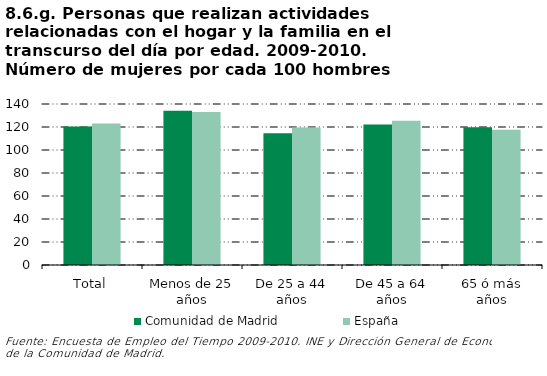
| Category | Comunidad de Madrid | España |
|---|---|---|
| Total | 120.494 | 123.025 |
| Menos de 25 años | 134.086 | 133.099 |
| De 25 a 44 años | 114.512 | 119.571 |
| De 45 a 64 años | 122.105 | 125.485 |
| 65 ó más años | 119.866 | 117.684 |